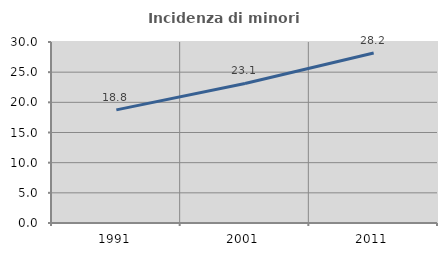
| Category | Incidenza di minori stranieri |
|---|---|
| 1991.0 | 18.75 |
| 2001.0 | 23.134 |
| 2011.0 | 28.173 |